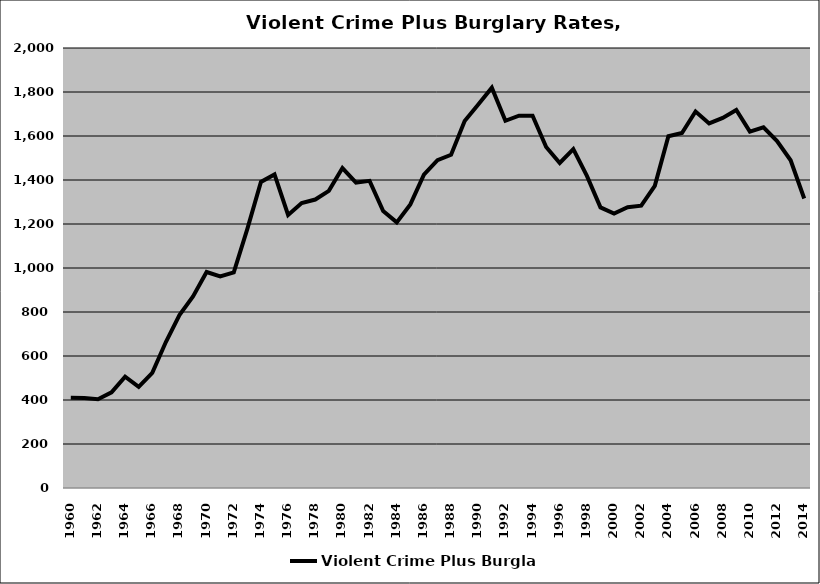
| Category | Violent Crime Plus Burglary |
|---|---|
| 1960.0 | 409.96 |
| 1961.0 | 408.737 |
| 1962.0 | 403.182 |
| 1963.0 | 434.769 |
| 1964.0 | 505.742 |
| 1965.0 | 459.49 |
| 1966.0 | 523.223 |
| 1967.0 | 663.364 |
| 1968.0 | 786.431 |
| 1969.0 | 871.128 |
| 1970.0 | 981.753 |
| 1971.0 | 961.626 |
| 1972.0 | 979.828 |
| 1973.0 | 1177.86 |
| 1974.0 | 1391.416 |
| 1975.0 | 1425.331 |
| 1976.0 | 1241.394 |
| 1977.0 | 1295.522 |
| 1978.0 | 1311.162 |
| 1979.0 | 1350.505 |
| 1980.0 | 1454.223 |
| 1981.0 | 1388.448 |
| 1982.0 | 1396.115 |
| 1983.0 | 1259.021 |
| 1984.0 | 1207.28 |
| 1985.0 | 1288.936 |
| 1986.0 | 1424.705 |
| 1987.0 | 1490.034 |
| 1988.0 | 1514.451 |
| 1989.0 | 1668.121 |
| 1990.0 | 1743.079 |
| 1991.0 | 1819.772 |
| 1992.0 | 1669.237 |
| 1993.0 | 1692.533 |
| 1994.0 | 1692.173 |
| 1995.0 | 1550.081 |
| 1996.0 | 1477.53 |
| 1997.0 | 1540.27 |
| 1998.0 | 1418.479 |
| 1999.0 | 1275.392 |
| 2000.0 | 1247.363 |
| 2001.0 | 1276.061 |
| 2002.0 | 1283.317 |
| 2003.0 | 1373.464 |
| 2004.0 | 1598.727 |
| 2005.0 | 1613.57 |
| 2006.0 | 1711.604 |
| 2007.0 | 1656.944 |
| 2008.0 | 1682.286 |
| 2009.0 | 1718.597 |
| 2010.0 | 1620.279 |
| 2011.0 | 1639.873 |
| 2012.0 | 1577.177 |
| 2013.0 | 1489.608 |
| 2014.0 | 1315.851 |